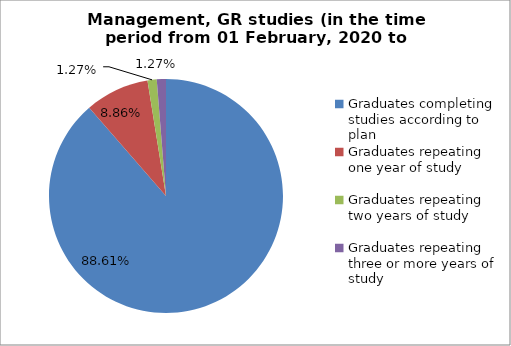
| Category | Series 0 |
|---|---|
| Graduates completing studies according to plan | 88.608 |
| Graduates repeating one year of study | 8.861 |
| Graduates repeating two years of study | 1.266 |
| Graduates repeating three or more years of study | 1.266 |